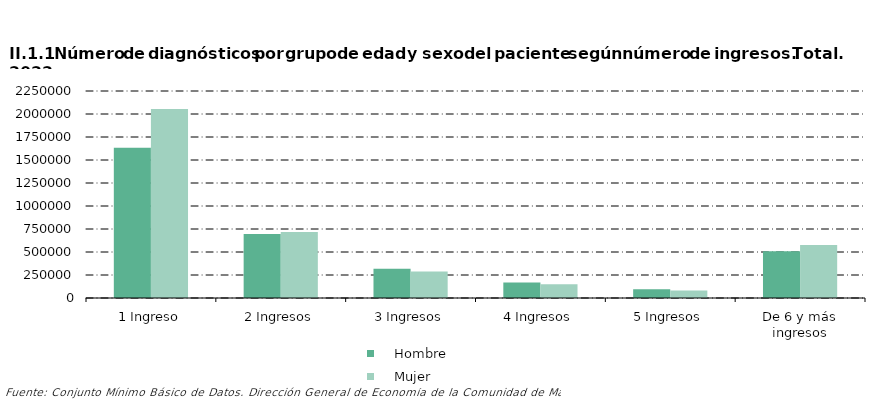
| Category |     Hombre |     Mujer |
|---|---|---|
| 1 Ingreso | 1633785 | 2054023 |
| 2 Ingresos | 696635 | 716902 |
| 3 Ingresos | 319096 | 288962 |
| 4 Ingresos | 167698 | 148142 |
| 5 Ingresos | 94393 | 81421 |
| De 6 y más ingresos | 508257 | 577052 |